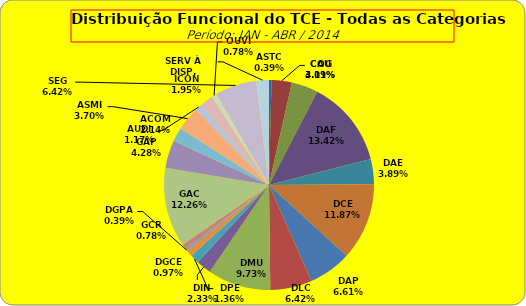
| Category | ASTC COG CAU DAF DAE DCE DAP DLC DMU DIN DPE DGCE DGPA GCR GAC GAP ACOM ASMI AUDI ICON OUVI SEG SERV À DISP. |
|---|---|
| ASTC | 2 |
| COG | 16 |
| CAU | 21 |
| DAF | 69 |
| DAE | 20 |
| DCE | 61 |
| DAP | 34 |
| DLC | 33 |
| DMU | 50 |
| DIN | 12 |
| DPE | 7 |
| DGCE | 5 |
| DGPA | 2 |
| GCR | 4 |
| GAC | 63 |
| GAP | 22 |
| ACOM | 11 |
| ASMI | 19 |
| AUDI | 6 |
| ICON | 10 |
| OUVI | 4 |
| SEG | 33 |
| SERV À DISP. | 10 |